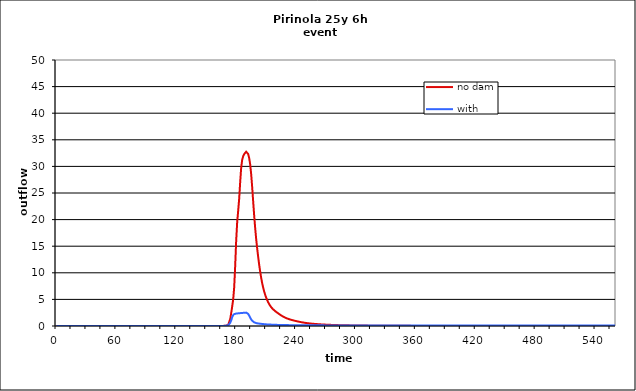
| Category | no dam | with dam |
|---|---|---|
| 0.0 | 0 | 0 |
| 1.0 | 0 | 0 |
| 2.0 | 0 | 0 |
| 3.0 | 0 | 0 |
| 4.0 | 0 | 0 |
| 5.0 | 0 | 0 |
| 6.0 | 0 | 0 |
| 7.0 | 0 | 0 |
| 8.0 | 0 | 0 |
| 9.0 | 0 | 0 |
| 10.0 | 0 | 0 |
| 11.0 | 0 | 0 |
| 12.0 | 0 | 0 |
| 13.0 | 0 | 0 |
| 14.0 | 0 | 0 |
| 15.0 | 0 | 0 |
| 16.0 | 0 | 0 |
| 17.0 | 0 | 0 |
| 18.0 | 0 | 0 |
| 19.0 | 0 | 0 |
| 20.0 | 0 | 0 |
| 21.0 | 0 | 0 |
| 22.0 | 0 | 0 |
| 23.0 | 0 | 0 |
| 24.0 | 0 | 0 |
| 25.0 | 0 | 0 |
| 26.0 | 0 | 0 |
| 27.0 | 0 | 0 |
| 28.0 | 0 | 0 |
| 29.0 | 0 | 0 |
| 30.0 | 0 | 0 |
| 31.0 | 0 | 0 |
| 32.0 | 0 | 0 |
| 33.0 | 0 | 0 |
| 34.0 | 0 | 0 |
| 35.0 | 0 | 0 |
| 36.0 | 0 | 0 |
| 37.0 | 0 | 0 |
| 38.0 | 0 | 0 |
| 39.0 | 0 | 0 |
| 40.0 | 0 | 0 |
| 41.0 | 0 | 0 |
| 42.0 | 0 | 0 |
| 43.0 | 0 | 0 |
| 44.0 | 0 | 0 |
| 45.0 | 0 | 0 |
| 46.0 | 0 | 0 |
| 47.0 | 0 | 0 |
| 48.0 | 0 | 0 |
| 49.0 | 0 | 0 |
| 50.0 | 0 | 0 |
| 51.0 | 0 | 0 |
| 52.0 | 0 | 0 |
| 53.0 | 0 | 0 |
| 54.0 | 0 | 0 |
| 55.0 | 0 | 0 |
| 56.0 | 0 | 0 |
| 57.0 | 0 | 0 |
| 58.0 | 0 | 0 |
| 59.0 | 0 | 0 |
| 60.0 | 0 | 0 |
| 61.0 | 0 | 0 |
| 62.0 | 0 | 0 |
| 63.0 | 0 | 0 |
| 64.0 | 0 | 0 |
| 65.0 | 0 | 0 |
| 66.0 | 0 | 0 |
| 67.0 | 0 | 0 |
| 68.0 | 0 | 0 |
| 69.0 | 0 | 0 |
| 70.0 | 0 | 0 |
| 71.0 | 0 | 0 |
| 72.0 | 0 | 0 |
| 73.0 | 0 | 0 |
| 74.0 | 0 | 0 |
| 75.0 | 0 | 0 |
| 76.0 | 0 | 0 |
| 77.0 | 0 | 0 |
| 78.0 | 0 | 0 |
| 79.0 | 0 | 0 |
| 80.0 | 0 | 0 |
| 81.0 | 0 | 0 |
| 82.0 | 0 | 0 |
| 83.0 | 0 | 0 |
| 84.0 | 0 | 0 |
| 85.0 | 0 | 0 |
| 86.0 | 0 | 0 |
| 87.0 | 0 | 0 |
| 88.0 | 0 | 0 |
| 89.0 | 0 | 0 |
| 90.0 | 0 | 0 |
| 91.0 | 0 | 0 |
| 92.0 | 0 | 0 |
| 93.0 | 0 | 0 |
| 94.0 | 0 | 0 |
| 95.0 | 0 | 0 |
| 96.0 | 0 | 0 |
| 97.0 | 0 | 0 |
| 98.0 | 0 | 0 |
| 99.0 | 0 | 0 |
| 100.0 | 0 | 0 |
| 101.0 | 0 | 0 |
| 102.0 | 0 | 0 |
| 103.0 | 0 | 0 |
| 104.0 | 0 | 0 |
| 105.0 | 0 | 0 |
| 106.0 | 0 | 0 |
| 107.0 | 0 | 0 |
| 108.0 | 0 | 0 |
| 109.0 | 0 | 0 |
| 110.0 | 0 | 0 |
| 111.0 | 0 | 0 |
| 112.0 | 0 | 0 |
| 113.0 | 0 | 0 |
| 114.0 | 0 | 0 |
| 115.0 | 0 | 0 |
| 116.0 | 0 | 0 |
| 117.0 | 0 | 0 |
| 118.0 | 0 | 0 |
| 119.0 | 0 | 0 |
| 120.0 | 0 | 0 |
| 121.0 | 0 | 0 |
| 122.0 | 0 | 0 |
| 123.0 | 0 | 0 |
| 124.0 | 0 | 0 |
| 125.0 | 0 | 0 |
| 126.0 | 0 | 0 |
| 127.0 | 0 | 0 |
| 128.0 | 0 | 0 |
| 129.0 | 0 | 0 |
| 130.0 | 0 | 0 |
| 131.0 | 0 | 0 |
| 132.0 | 0 | 0 |
| 133.0 | 0 | 0 |
| 134.0 | 0 | 0 |
| 135.0 | 0 | 0 |
| 136.0 | 0 | 0 |
| 137.0 | 0 | 0 |
| 138.0 | 0 | 0 |
| 139.0 | 0 | 0 |
| 140.0 | 0 | 0 |
| 141.0 | 0 | 0 |
| 142.0 | 0 | 0 |
| 143.0 | 0 | 0 |
| 144.0 | 0 | 0 |
| 145.0 | 0 | 0 |
| 146.0 | 0 | 0 |
| 147.0 | 0 | 0 |
| 148.0 | 0 | 0 |
| 149.0 | 0 | 0 |
| 150.0 | 0 | 0 |
| 151.0 | 0 | 0 |
| 152.0 | 0 | 0 |
| 153.0 | 0 | 0 |
| 154.0 | 0.001 | 0.001 |
| 155.0 | 0.001 | 0.001 |
| 156.0 | 0.001 | 0.001 |
| 157.0 | 0.001 | 0.001 |
| 158.0 | 0.001 | 0.001 |
| 159.0 | 0.002 | 0.002 |
| 160.0 | 0.002 | 0.002 |
| 161.0 | 0.002 | 0.002 |
| 162.0 | 0.003 | 0.003 |
| 163.0 | 0.003 | 0.003 |
| 164.0 | 0.004 | 0.004 |
| 165.0 | 0.006 | 0.006 |
| 166.0 | 0.009 | 0.008 |
| 167.0 | 0.018 | 0.015 |
| 168.0 | 0.029 | 0.023 |
| 169.0 | 0.048 | 0.037 |
| 170.0 | 0.073 | 0.057 |
| 171.0 | 0.106 | 0.086 |
| 172.0 | 0.183 | 0.148 |
| 173.0 | 0.318 | 0.277 |
| 174.0 | 1.292 | 0.591 |
| 175.0 | 2.421 | 1.061 |
| 176.0 | 3.655 | 1.639 |
| 177.0 | 4.979 | 2.038 |
| 178.0 | 7.239 | 2.23 |
| 179.0 | 11.268 | 2.304 |
| 180.0 | 16.005 | 2.338 |
| 181.0 | 19.496 | 2.362 |
| 182.0 | 21.64 | 2.382 |
| 183.0 | 23.902 | 2.401 |
| 184.0 | 27.014 | 2.419 |
| 185.0 | 29.733 | 2.436 |
| 186.0 | 31.223 | 2.453 |
| 187.0 | 31.906 | 2.469 |
| 188.0 | 32.291 | 2.485 |
| 189.0 | 32.551 | 2.501 |
| 190.0 | 32.755 | 2.517 |
| 191.0 | 32.703 | 2.47 |
| 192.0 | 32.329 | 2.271 |
| 193.0 | 31.593 | 1.955 |
| 194.0 | 30.407 | 1.584 |
| 195.0 | 28.586 | 1.25 |
| 196.0 | 26.188 | 0.997 |
| 197.0 | 23.477 | 0.821 |
| 198.0 | 20.843 | 0.698 |
| 199.0 | 18.476 | 0.611 |
| 200.0 | 16.435 | 0.551 |
| 201.0 | 14.647 | 0.509 |
| 202.0 | 13.049 | 0.478 |
| 203.0 | 11.582 | 0.452 |
| 204.0 | 10.264 | 0.428 |
| 205.0 | 9.105 | 0.406 |
| 206.0 | 8.103 | 0.384 |
| 207.0 | 7.248 | 0.362 |
| 208.0 | 6.525 | 0.341 |
| 209.0 | 5.899 | 0.323 |
| 210.0 | 5.358 | 0.309 |
| 211.0 | 4.892 | 0.297 |
| 212.0 | 4.484 | 0.287 |
| 213.0 | 4.129 | 0.277 |
| 214.0 | 3.821 | 0.268 |
| 215.0 | 3.559 | 0.259 |
| 216.0 | 3.334 | 0.249 |
| 217.0 | 3.14 | 0.24 |
| 218.0 | 2.968 | 0.232 |
| 219.0 | 2.811 | 0.225 |
| 220.0 | 2.665 | 0.218 |
| 221.0 | 2.523 | 0.212 |
| 222.0 | 2.387 | 0.206 |
| 223.0 | 2.252 | 0.202 |
| 224.0 | 2.123 | 0.197 |
| 225.0 | 1.998 | 0.193 |
| 226.0 | 1.88 | 0.188 |
| 227.0 | 1.77 | 0.184 |
| 228.0 | 1.67 | 0.18 |
| 229.0 | 1.578 | 0.176 |
| 230.0 | 1.493 | 0.173 |
| 231.0 | 1.417 | 0.169 |
| 232.0 | 1.348 | 0.166 |
| 233.0 | 1.284 | 0.163 |
| 234.0 | 1.225 | 0.16 |
| 235.0 | 1.169 | 0.157 |
| 236.0 | 1.117 | 0.155 |
| 237.0 | 1.066 | 0.152 |
| 238.0 | 1.018 | 0.149 |
| 239.0 | 0.971 | 0.147 |
| 240.0 | 0.926 | 0.145 |
| 241.0 | 0.882 | 0.143 |
| 242.0 | 0.84 | 0.141 |
| 243.0 | 0.8 | 0.14 |
| 244.0 | 0.762 | 0.138 |
| 245.0 | 0.725 | 0.137 |
| 246.0 | 0.69 | 0.135 |
| 247.0 | 0.658 | 0.134 |
| 248.0 | 0.626 | 0.132 |
| 249.0 | 0.597 | 0.131 |
| 250.0 | 0.569 | 0.129 |
| 251.0 | 0.543 | 0.128 |
| 252.0 | 0.519 | 0.127 |
| 253.0 | 0.496 | 0.126 |
| 254.0 | 0.475 | 0.125 |
| 255.0 | 0.455 | 0.125 |
| 256.0 | 0.437 | 0.124 |
| 257.0 | 0.419 | 0.123 |
| 258.0 | 0.402 | 0.122 |
| 259.0 | 0.386 | 0.121 |
| 260.0 | 0.371 | 0.121 |
| 261.0 | 0.357 | 0.12 |
| 262.0 | 0.343 | 0.12 |
| 263.0 | 0.33 | 0.119 |
| 264.0 | 0.317 | 0.119 |
| 265.0 | 0.305 | 0.118 |
| 266.0 | 0.293 | 0.118 |
| 267.0 | 0.282 | 0.117 |
| 268.0 | 0.272 | 0.117 |
| 269.0 | 0.262 | 0.117 |
| 270.0 | 0.252 | 0.116 |
| 271.0 | 0.243 | 0.116 |
| 272.0 | 0.234 | 0.116 |
| 273.0 | 0.226 | 0.116 |
| 274.0 | 0.218 | 0.115 |
| 275.0 | 0.21 | 0.115 |
| 276.0 | 0.203 | 0.115 |
| 277.0 | 0.196 | 0.115 |
| 278.0 | 0.19 | 0.115 |
| 279.0 | 0.183 | 0.115 |
| 280.0 | 0.177 | 0.115 |
| 281.0 | 0.171 | 0.115 |
| 282.0 | 0.166 | 0.115 |
| 283.0 | 0.161 | 0.115 |
| 284.0 | 0.156 | 0.114 |
| 285.0 | 0.151 | 0.114 |
| 286.0 | 0.146 | 0.114 |
| 287.0 | 0.142 | 0.114 |
| 288.0 | 0.138 | 0.114 |
| 289.0 | 0.134 | 0.114 |
| 290.0 | 0.13 | 0.114 |
| 291.0 | 0.126 | 0.114 |
| 292.0 | 0.122 | 0.114 |
| 293.0 | 0.119 | 0.114 |
| 294.0 | 0.115 | 0.114 |
| 295.0 | 0.112 | 0.114 |
| 296.0 | 0.109 | 0.114 |
| 297.0 | 0.106 | 0.114 |
| 298.0 | 0.103 | 0.114 |
| 299.0 | 0.1 | 0.114 |
| 300.0 | 0.097 | 0.114 |
| 301.0 | 0.094 | 0.114 |
| 302.0 | 0.092 | 0.114 |
| 303.0 | 0.089 | 0.114 |
| 304.0 | 0.087 | 0.114 |
| 305.0 | 0.084 | 0.114 |
| 306.0 | 0.082 | 0.114 |
| 307.0 | 0.08 | 0.114 |
| 308.0 | 0.078 | 0.114 |
| 309.0 | 0.076 | 0.114 |
| 310.0 | 0.074 | 0.114 |
| 311.0 | 0.072 | 0.114 |
| 312.0 | 0.07 | 0.114 |
| 313.0 | 0.068 | 0.114 |
| 314.0 | 0.066 | 0.114 |
| 315.0 | 0.064 | 0.114 |
| 316.0 | 0.063 | 0.114 |
| 317.0 | 0.061 | 0.114 |
| 318.0 | 0.059 | 0.114 |
| 319.0 | 0.058 | 0.114 |
| 320.0 | 0.056 | 0.114 |
| 321.0 | 0.055 | 0.114 |
| 322.0 | 0.053 | 0.114 |
| 323.0 | 0.052 | 0.114 |
| 324.0 | 0.051 | 0.114 |
| 325.0 | 0.049 | 0.114 |
| 326.0 | 0.048 | 0.114 |
| 327.0 | 0.047 | 0.114 |
| 328.0 | 0.046 | 0.114 |
| 329.0 | 0.044 | 0.114 |
| 330.0 | 0.043 | 0.114 |
| 331.0 | 0.042 | 0.114 |
| 332.0 | 0.041 | 0.114 |
| 333.0 | 0.04 | 0.114 |
| 334.0 | 0.039 | 0.114 |
| 335.0 | 0.038 | 0.114 |
| 336.0 | 0.037 | 0.114 |
| 337.0 | 0.036 | 0.114 |
| 338.0 | 0.035 | 0.114 |
| 339.0 | 0.034 | 0.114 |
| 340.0 | 0.033 | 0.114 |
| 341.0 | 0.033 | 0.114 |
| 342.0 | 0.032 | 0.114 |
| 343.0 | 0.031 | 0.114 |
| 344.0 | 0.03 | 0.114 |
| 345.0 | 0.029 | 0.114 |
| 346.0 | 0.029 | 0.114 |
| 347.0 | 0.028 | 0.114 |
| 348.0 | 0.027 | 0.114 |
| 349.0 | 0.027 | 0.114 |
| 350.0 | 0.026 | 0.114 |
| 351.0 | 0.025 | 0.114 |
| 352.0 | 0.025 | 0.114 |
| 353.0 | 0.024 | 0.114 |
| 354.0 | 0.024 | 0.114 |
| 355.0 | 0.023 | 0.114 |
| 356.0 | 0.023 | 0.114 |
| 357.0 | 0.022 | 0.114 |
| 358.0 | 0.022 | 0.114 |
| 359.0 | 0.021 | 0.114 |
| 360.0 | 0.021 | 0.114 |
| 361.0 | 0.02 | 0.114 |
| 362.0 | 0.02 | 0.114 |
| 363.0 | 0.019 | 0.114 |
| 364.0 | 0.019 | 0.114 |
| 365.0 | 0.018 | 0.114 |
| 366.0 | 0.018 | 0.114 |
| 367.0 | 0.018 | 0.114 |
| 368.0 | 0.017 | 0.114 |
| 369.0 | 0.017 | 0.114 |
| 370.0 | 0.017 | 0.114 |
| 371.0 | 0.016 | 0.114 |
| 372.0 | 0.016 | 0.114 |
| 373.0 | 0.016 | 0.114 |
| 374.0 | 0.015 | 0.114 |
| 375.0 | 0.015 | 0.114 |
| 376.0 | 0.015 | 0.114 |
| 377.0 | 0.014 | 0.114 |
| 378.0 | 0.014 | 0.114 |
| 379.0 | 0.014 | 0.114 |
| 380.0 | 0.014 | 0.114 |
| 381.0 | 0.013 | 0.114 |
| 382.0 | 0.013 | 0.114 |
| 383.0 | 0.013 | 0.114 |
| 384.0 | 0.013 | 0.114 |
| 385.0 | 0.012 | 0.114 |
| 386.0 | 0.012 | 0.114 |
| 387.0 | 0.012 | 0.114 |
| 388.0 | 0.012 | 0.114 |
| 389.0 | 0.011 | 0.114 |
| 390.0 | 0.011 | 0.114 |
| 391.0 | 0.011 | 0.114 |
| 392.0 | 0.011 | 0.114 |
| 393.0 | 0.01 | 0.114 |
| 394.0 | 0.01 | 0.114 |
| 395.0 | 0.01 | 0.114 |
| 396.0 | 0.01 | 0.114 |
| 397.0 | 0.009 | 0.113 |
| 398.0 | 0.009 | 0.113 |
| 399.0 | 0.009 | 0.113 |
| 400.0 | 0.009 | 0.113 |
| 401.0 | 0.008 | 0.113 |
| 402.0 | 0.008 | 0.113 |
| 403.0 | 0.008 | 0.113 |
| 404.0 | 0.008 | 0.113 |
| 405.0 | 0.008 | 0.113 |
| 406.0 | 0.008 | 0.113 |
| 407.0 | 0.007 | 0.113 |
| 408.0 | 0.007 | 0.113 |
| 409.0 | 0.007 | 0.113 |
| 410.0 | 0.007 | 0.113 |
| 411.0 | 0.007 | 0.113 |
| 412.0 | 0.006 | 0.113 |
| 413.0 | 0.006 | 0.113 |
| 414.0 | 0.006 | 0.113 |
| 415.0 | 0.006 | 0.113 |
| 416.0 | 0.006 | 0.113 |
| 417.0 | 0.006 | 0.113 |
| 418.0 | 0.005 | 0.113 |
| 419.0 | 0.005 | 0.113 |
| 420.0 | 0.005 | 0.113 |
| 421.0 | 0.005 | 0.113 |
| 422.0 | 0.005 | 0.113 |
| 423.0 | 0.005 | 0.113 |
| 424.0 | 0.005 | 0.113 |
| 425.0 | 0.005 | 0.113 |
| 426.0 | 0.004 | 0.113 |
| 427.0 | 0.004 | 0.113 |
| 428.0 | 0.004 | 0.113 |
| 429.0 | 0.004 | 0.113 |
| 430.0 | 0.004 | 0.113 |
| 431.0 | 0.004 | 0.113 |
| 432.0 | 0.004 | 0.113 |
| 433.0 | 0.004 | 0.113 |
| 434.0 | 0.003 | 0.113 |
| 435.0 | 0.003 | 0.113 |
| 436.0 | 0.003 | 0.113 |
| 437.0 | 0.003 | 0.113 |
| 438.0 | 0.003 | 0.113 |
| 439.0 | 0.003 | 0.113 |
| 440.0 | 0.003 | 0.113 |
| 441.0 | 0.003 | 0.113 |
| 442.0 | 0.002 | 0.113 |
| 443.0 | 0.002 | 0.113 |
| 444.0 | 0.002 | 0.113 |
| 445.0 | 0.002 | 0.113 |
| 446.0 | 0.002 | 0.113 |
| 447.0 | 0.002 | 0.113 |
| 448.0 | 0.002 | 0.113 |
| 449.0 | 0.002 | 0.113 |
| 450.0 | 0.002 | 0.113 |
| 451.0 | 0.001 | 0.113 |
| 452.0 | 0.001 | 0.113 |
| 453.0 | 0.001 | 0.113 |
| 454.0 | 0.001 | 0.113 |
| 455.0 | 0.001 | 0.113 |
| 456.0 | 0.001 | 0.113 |
| 457.0 | 0.001 | 0.113 |
| 458.0 | 0.001 | 0.113 |
| 459.0 | 0.001 | 0.113 |
| 460.0 | 0.001 | 0.113 |
| 461.0 | 0.001 | 0.113 |
| 462.0 | 0.001 | 0.113 |
| 463.0 | 0.001 | 0.113 |
| 464.0 | 0.001 | 0.113 |
| 465.0 | 0.001 | 0.113 |
| 466.0 | 0.001 | 0.113 |
| 467.0 | 0 | 0.113 |
| 468.0 | 0 | 0.113 |
| 469.0 | 0 | 0.113 |
| 470.0 | 0 | 0.113 |
| 471.0 | 0 | 0.113 |
| 472.0 | 0 | 0.113 |
| 473.0 | 0 | 0.113 |
| 474.0 | 0 | 0.113 |
| 475.0 | 0 | 0.113 |
| 476.0 | 0 | 0.113 |
| 477.0 | 0 | 0.113 |
| 478.0 | 0 | 0.113 |
| 479.0 | 0 | 0.112 |
| 480.0 | 0 | 0.112 |
| 481.0 | 0 | 0.112 |
| 482.0 | 0 | 0.112 |
| 483.0 | 0 | 0.112 |
| 484.0 | 0 | 0.112 |
| 485.0 | 0 | 0.112 |
| 486.0 | 0 | 0.112 |
| 487.0 | 0 | 0.112 |
| 488.0 | 0 | 0.112 |
| 489.0 | 0 | 0.112 |
| 490.0 | 0 | 0.112 |
| 491.0 | 0 | 0.112 |
| 492.0 | 0 | 0.112 |
| 493.0 | 0 | 0.112 |
| 494.0 | 0 | 0.112 |
| 495.0 | 0 | 0.112 |
| 496.0 | 0 | 0.112 |
| 497.0 | 0 | 0.112 |
| 498.0 | 0 | 0.112 |
| 499.0 | 0 | 0.112 |
| 500.0 | 0 | 0.112 |
| 501.0 | 0 | 0.112 |
| 502.0 | 0 | 0.112 |
| 503.0 | 0 | 0.112 |
| 504.0 | 0 | 0.112 |
| 505.0 | 0 | 0.112 |
| 506.0 | 0 | 0.112 |
| 507.0 | 0 | 0.112 |
| 508.0 | 0 | 0.112 |
| 509.0 | 0 | 0.112 |
| 510.0 | 0 | 0.112 |
| 511.0 | 0 | 0.112 |
| 512.0 | 0 | 0.112 |
| 513.0 | 0 | 0.112 |
| 514.0 | 0 | 0.112 |
| 515.0 | 0 | 0.112 |
| 516.0 | 0 | 0.112 |
| 517.0 | 0 | 0.112 |
| 518.0 | 0 | 0.112 |
| 519.0 | 0 | 0.112 |
| 520.0 | 0 | 0.112 |
| 521.0 | 0 | 0.112 |
| 522.0 | 0 | 0.112 |
| 523.0 | 0 | 0.112 |
| 524.0 | 0 | 0.112 |
| 525.0 | 0 | 0.112 |
| 526.0 | 0 | 0.112 |
| 527.0 | 0 | 0.112 |
| 528.0 | 0 | 0.112 |
| 529.0 | 0 | 0.112 |
| 530.0 | 0 | 0.112 |
| 531.0 | 0 | 0.112 |
| 532.0 | 0 | 0.112 |
| 533.0 | 0 | 0.112 |
| 534.0 | 0 | 0.112 |
| 535.0 | 0 | 0.112 |
| 536.0 | 0 | 0.112 |
| 537.0 | 0 | 0.112 |
| 538.0 | 0 | 0.112 |
| 539.0 | 0 | 0.112 |
| 540.0 | 0 | 0.112 |
| 541.0 | 0 | 0.112 |
| 542.0 | 0 | 0.112 |
| 543.0 | 0 | 0.112 |
| 544.0 | 0 | 0.112 |
| 545.0 | 0 | 0.112 |
| 546.0 | 0 | 0.112 |
| 547.0 | 0 | 0.112 |
| 548.0 | 0 | 0.112 |
| 549.0 | 0 | 0.112 |
| 550.0 | 0 | 0.112 |
| 551.0 | 0 | 0.112 |
| 552.0 | 0 | 0.112 |
| 553.0 | 0 | 0.112 |
| 554.0 | 0 | 0.112 |
| 555.0 | 0 | 0.111 |
| 556.0 | 0 | 0.111 |
| 557.0 | 0 | 0.111 |
| 558.0 | 0 | 0.111 |
| 559.0 | 0 | 0.111 |
| 560.0 | 0 | 0.111 |